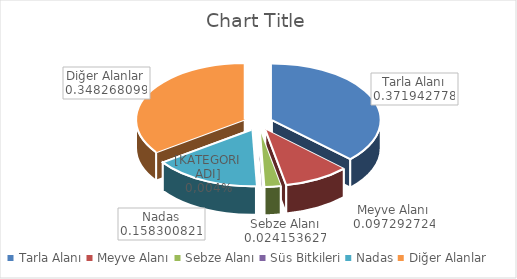
| Category | Series 0 |
|---|---|
| Tarla Alanı | 106392 |
| Meyve Alanı | 27830 |
| Sebze Alanı | 6909 |
| Süs Bitkileri | 12 |
| Nadas | 45281 |
| Diğer Alanlar | 99620 |